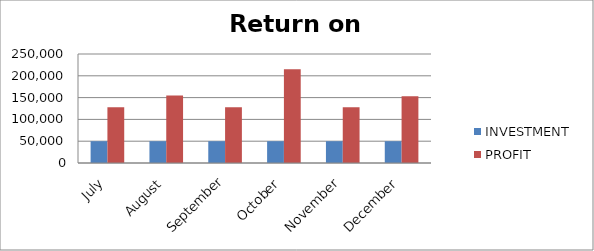
| Category | INVESTMENT  | PROFIT |
|---|---|---|
| July | 50000 | 127679 |
| August | 50000 | 154994 |
| September | 50000 | 127951 |
| October | 50000 | 214845 |
| November | 50000 | 128050 |
| December | 50000 | 153141 |